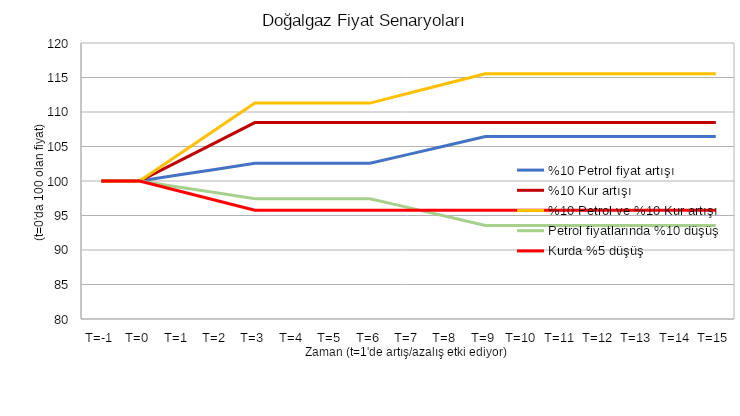
| Category | %10 Petrol fiyat artışı | %10 Kur artışı | %10 Petrol ve %10 Kur artışı | Petrol fiyatlarında %10 düşüş | Kurda %5 düşüş |
|---|---|---|---|---|---|
| T=-1 | 100 | 100 | 100 | 100 | 100 |
| T=0 | 100 | 100 | 100 | 100 | 100 |
| T=1 | 100.858 | 102.82 | 103.764 | 99.142 | 98.59 |
| T=2 | 101.716 | 105.641 | 107.528 | 98.284 | 97.18 |
| T=3 | 102.574 | 108.461 | 111.292 | 97.426 | 95.769 |
| T=4 | 102.574 | 108.461 | 111.292 | 97.426 | 95.769 |
| T=5 | 102.574 | 108.461 | 111.292 | 97.426 | 95.769 |
| T=6 | 102.574 | 108.461 | 111.292 | 97.426 | 95.769 |
| T=7 | 103.861 | 108.461 | 112.708 | 96.139 | 95.769 |
| T=8 | 105.147 | 108.461 | 114.123 | 94.853 | 95.769 |
| T=9 | 106.434 | 108.461 | 115.539 | 93.566 | 95.769 |
| T=10 | 106.434 | 108.461 | 115.539 | 93.566 | 95.769 |
| T=11 | 106.434 | 108.461 | 115.539 | 93.566 | 95.769 |
| T=12 | 106.434 | 108.461 | 115.539 | 93.566 | 95.769 |
| T=13 | 106.434 | 108.461 | 115.539 | 93.566 | 95.769 |
| T=14 | 106.434 | 108.461 | 115.539 | 93.566 | 95.769 |
| T=15 | 106.434 | 108.461 | 115.539 | 93.566 | 95.769 |